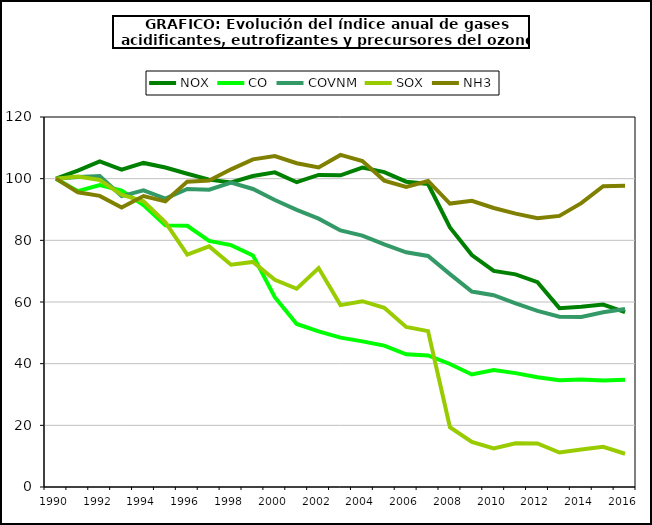
| Category | NOX | CO | COVNM | SOX | NH3 |
|---|---|---|---|---|---|
| 1990.0 | 100 | 100 | 100 | 100 | 100 |
| 1991.0 | 102.618 | 95.932 | 100.523 | 100.687 | 95.6 |
| 1992.0 | 105.574 | 97.955 | 100.877 | 99.562 | 94.423 |
| 1993.0 | 102.917 | 96.162 | 94.331 | 94.837 | 90.662 |
| 1994.0 | 105.102 | 91.415 | 96.227 | 92.659 | 94.365 |
| 1995.0 | 103.601 | 84.905 | 93.529 | 85.855 | 92.646 |
| 1996.0 | 101.604 | 84.722 | 96.658 | 75.368 | 99.038 |
| 1997.0 | 99.694 | 79.819 | 96.43 | 78.04 | 99.375 |
| 1998.0 | 98.758 | 78.453 | 98.734 | 72.084 | 103.024 |
| 1999.0 | 100.847 | 75.109 | 96.656 | 72.997 | 106.266 |
| 2000.0 | 102.035 | 61.555 | 93.07 | 67.199 | 107.329 |
| 2001.0 | 98.852 | 52.859 | 89.905 | 64.293 | 105.013 |
| 2002.0 | 101.214 | 50.482 | 87.041 | 71.008 | 103.641 |
| 2003.0 | 101.103 | 48.44 | 83.199 | 58.994 | 107.707 |
| 2004.0 | 103.591 | 47.235 | 81.51 | 60.263 | 105.721 |
| 2005.0 | 102.128 | 45.839 | 78.703 | 58.099 | 99.373 |
| 2006.0 | 99.025 | 43.058 | 76.133 | 51.916 | 97.35 |
| 2007.0 | 98.275 | 42.669 | 74.92 | 50.559 | 99.259 |
| 2008.0 | 84.165 | 39.894 | 69.043 | 19.365 | 91.931 |
| 2009.0 | 75.22 | 36.494 | 63.376 | 14.655 | 92.84 |
| 2010.0 | 70.076 | 37.921 | 62.204 | 12.488 | 90.496 |
| 2011.0 | 68.956 | 36.927 | 59.566 | 14.156 | 88.669 |
| 2012.0 | 66.429 | 35.596 | 57.123 | 14.1 | 87.159 |
| 2013.0 | 58.007 | 34.658 | 55.232 | 11.178 | 87.927 |
| 2014.0 | 58.426 | 34.852 | 55.165 | 12.192 | 92.062 |
| 2015.0 | 59.161 | 34.563 | 56.656 | 13.02 | 97.542 |
| 2016.0 | 56.704 | 34.819 | 57.711 | 10.788 | 97.673 |